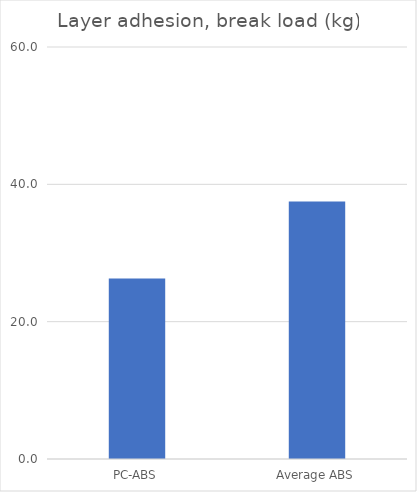
| Category | Average (kg) |
|---|---|
| PC-ABS | 26.3 |
| Average ABS | 37.5 |